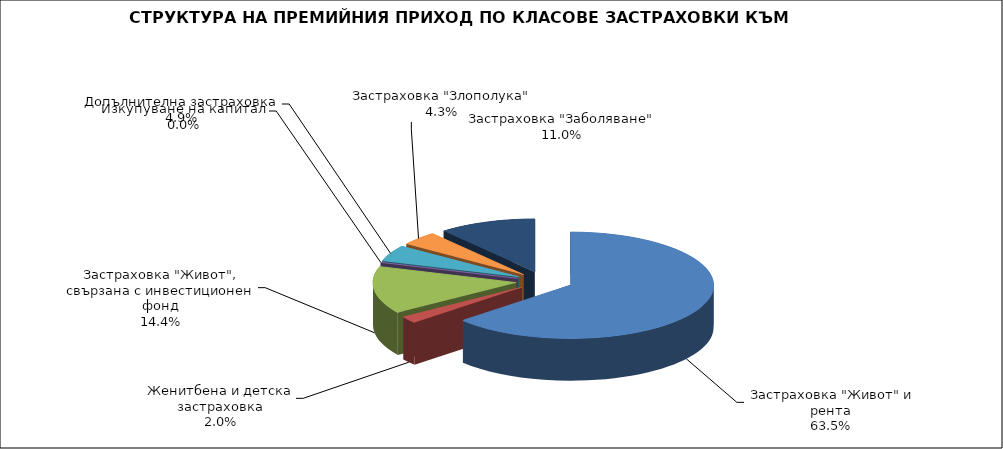
| Category |  Застраховка "Живот" и рента |
|---|---|
|  Застраховка "Живот" и рента | 214845570.182 |
| Женитбена и детска застраховка | 6825757.203 |
| Застраховка "Живот", свързана с инвестиционен фонд | 48666968.592 |
| Изкупуване на капитал | 0 |
| Допълнителна застраховка | 16588606.366 |
| Застраховка "Злополука" | 14425713.633 |
| Застраховка "Заболяване" | 37103699.039 |